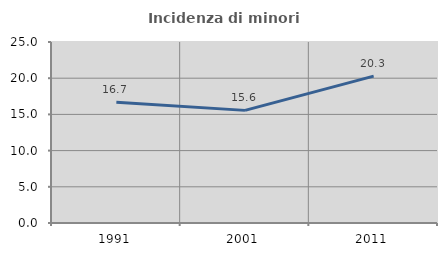
| Category | Incidenza di minori stranieri |
|---|---|
| 1991.0 | 16.667 |
| 2001.0 | 15.556 |
| 2011.0 | 20.29 |